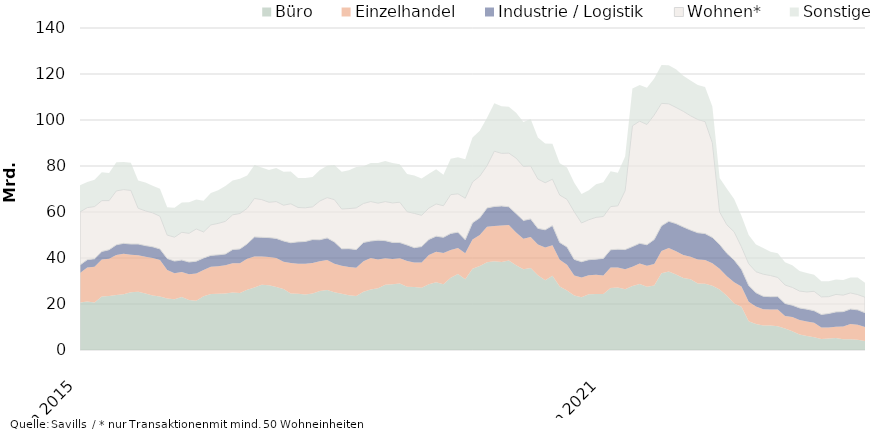
| Category | Büro | Einzelhandel | Industrie / Logistik | Wohnen* | Sonstige |
|---|---|---|---|---|---|
| 2015-06-01 | 20611425655.83 | 12812582743.14 | 3559231021.83 | 23077039312.51 | 11574720193.75 |
| 2015-07-01 | 21076839103.5 | 14823063179.21 | 3371725415.86 | 22644697118.35 | 11143910205.21 |
| 2015-08-01 | 20653227203.5 | 15571305695.21 | 3450767146.86 | 22691607883.35 | 11626767372.21 |
| 2015-09-01 | 23298875023.46 | 16009456775.73 | 3520511283.36 | 22121631489.35 | 12279196997.21 |
| 2015-10-01 | 23498374427.46 | 16189404746.36 | 3919085482.36 | 21349455176.35 | 11987539478.21 |
| 2015-11-01 | 23954025189.14 | 17369965927.5 | 4397719316.13 | 23451887702.29 | 12443601394.38 |
| 2015-12-01 | 24202213697.48 | 17618123151.04 | 4557113724.92 | 23375825542.77 | 11975940305.75 |
| 2016-01-01 | 25139700628.48 | 16272043440.89 | 4662502872.92 | 23334161447.77 | 12028959045.24 |
| 2016-02-01 | 25294714349.53 | 15953136713.43 | 4833139363.87 | 15563498654.77 | 12008953720.01 |
| 2016-03-01 | 24531552016.74 | 15986530585.16 | 4877967507.07 | 15108592339.77 | 12318880326.08 |
| 2016-04-01 | 23664635919.74 | 16375601042.51 | 4833846127.82 | 14760671477.37 | 11756957541.08 |
| 2016-05-01 | 23247789321.82 | 15930775136.51 | 4749671116.82 | 14232081715.37 | 11979556735.04 |
| 2016-06-01 | 22420837658.36 | 12351345639.5 | 4999570420.67 | 10189436595.87 | 12067576140.06 |
| 2016-07-01 | 22110698739.69 | 11244286742 | 5312245465.64 | 10404072475.53 | 12817090834.96 |
| 2016-08-01 | 23017210888.69 | 10865589625 | 5247332254.55 | 12050427222.53 | 12924367433.96 |
| 2016-09-01 | 21717860067.73 | 11265452481.91 | 5270185116.55 | 12498985369.53 | 13466325785.26 |
| 2016-10-01 | 21373387260.86 | 11859258925.28 | 5398267322.55 | 14009495152.42 | 12815064855.83 |
| 2016-11-01 | 23415620900.76 | 11358767497.14 | 5243284144.73 | 11319606979.49 | 13584628478.66 |
| 2016-12-01 | 24307948042.4 | 11930121185.43 | 4890351002.13 | 13270662270.49 | 13860642419.64 |
| 2017-01-01 | 24506316607.4 | 11942448226.96 | 4924744810.37 | 13669156871.49 | 14439441490.58 |
| 2017-02-01 | 24519637636.41 | 12367156977.09 | 4842785725 | 14202672047.49 | 15399823383.58 |
| 2017-03-01 | 24979801711.4 | 12788632177.37 | 5899654543.8 | 15102734386.79 | 14961863124.58 |
| 2017-04-01 | 24819990861.71 | 12853810575.9 | 6262060580.1 | 15423928697.19 | 15066124285.67 |
| 2017-05-01 | 26232596283.47 | 13433810629.15 | 6483702097.1 | 15457101085.2 | 14297593389.28 |
| 2017-06-01 | 27213166704.1 | 13392868477.5 | 8562546401.46 | 16743694810.79 | 14470141007.56 |
| 2017-07-01 | 28420051498.1 | 12241064346.93 | 8324132158.46 | 16422200120.79 | 13950696505.2 |
| 2017-08-01 | 28135534177.1 | 12347854135.93 | 8386695707.55 | 15384373722.79 | 13979801046.2 |
| 2017-09-01 | 27443892685.45 | 12555755916.94 | 8510058041.55 | 16031838529.78 | 14628427847.74 |
| 2017-10-01 | 26496035870.32 | 11848885272.94 | 9048046430.46 | 15582452666.87 | 14494347450.17 |
| 2017-11-01 | 24585217292.17 | 13253346842.83 | 8802947546.51 | 16950078576.87 | 13991797246.44 |
| 2017-12-01 | 24440717997.53 | 13103303236.48 | 9470343512.7 | 14943089012.87 | 12875205655.48 |
| 2018-01-01 | 24169632440.53 | 13302862745.1 | 9721702683.46 | 14639835220.86 | 12965625420.04 |
| 2018-02-01 | 24532655677.47 | 13264199130.65 | 10213193365.46 | 14254040308.86 | 12991286516.04 |
| 2018-03-01 | 25689146433.48 | 12942239136.64 | 9307934893.46 | 16861797743.49 | 13423676924.02 |
| 2018-04-01 | 26121570226.17 | 13001007210.76 | 9605919650.46 | 17541166648.49 | 13812859535.93 |
| 2018-05-01 | 25059149940.41 | 12453300846.51 | 9488564046.46 | 18391492426.48 | 14988664801.36 |
| 2018-06-01 | 24502115752.78 | 12171100363.34 | 7330050155.1 | 17325340647.56 | 16180804689.08 |
| 2018-07-01 | 23768042590.78 | 12321500226.32 | 7966869588.1 | 17451608751.56 | 16672007493.19 |
| 2018-08-01 | 23510045994.76 | 12246339005.19 | 7892000709.1 | 18149274126.41 | 17798374873.04 |
| 2018-09-01 | 25341157455.41 | 13289291079.55 | 8129841438.1 | 16963704659.42 | 16165594775.21 |
| 2018-10-01 | 26253931201.41 | 13715615099.55 | 7406435586.25 | 17175676866.32 | 16705006538.21 |
| 2018-11-01 | 26888009103.45 | 12462758251.61 | 8394898728.54 | 16109073420.32 | 17423267492.25 |
| 2018-12-01 | 28411133671.45 | 11468134571.41 | 7666795490.35 | 16990643494.32 | 17659710774.26 |
| 2019-01-01 | 28624375832.45 | 10940028832.41 | 7214323719.35 | 17176960675.2 | 17313329869.26 |
| 2019-02-01 | 28937833501.45 | 10947599659.13 | 6831262259.96 | 17531208622.2 | 16557159059.62 |
| 2019-03-01 | 27544432810.45 | 11126614873.99 | 6985219187.16 | 14491959503.27 | 16426926447.64 |
| 2019-04-01 | 27372510768.31 | 10677191485.85 | 6436402186.06 | 14907572108.14 | 16464762534.89 |
| 2019-05-01 | 27086717264.31 | 10962789793.85 | 6927571752.06 | 13595173453.14 | 15944373230.89 |
| 2019-06-01 | 28619667307.82 | 12636558136.82 | 6809920057.06 | 13635038337.47 | 14918522741.96 |
| 2019-07-01 | 29482520307.29 | 13283688977.99 | 6728675032.06 | 14018057902.47 | 15124173896.92 |
| 2019-08-01 | 28588686723.31 | 13536417530.12 | 6860393893.06 | 13753502392.62 | 13483032208.07 |
| 2019-09-01 | 31438753529.25 | 11989411711.7 | 7256389082.92 | 16861240835.62 | 15593147025.83 |
| 2019-10-01 | 33003593891.25 | 11314584887.7 | 6912990961.55 | 16703291438.74 | 15889588476.83 |
| 2019-11-01 | 30754652298.78 | 11289743755.75 | 5911146296.79 | 18052115733.74 | 16938721442.52 |
| 2019-12-01 | 35340825930.49 | 12730856743.58 | 7244059319.45 | 17720972058.74 | 19305491136.48 |
| 2020-01-01 | 36538141462.49 | 13437626311.58 | 7470737760.23 | 18158224812.87 | 19678967754.48 |
| 2020-02-01 | 38106058526.44 | 15501005020.07 | 8171253646.38 | 18363765931.37 | 20829016891.2 |
| 2020-03-01 | 38557852732.89 | 15349976510.85 | 8488042572.18 | 24050048197.37 | 20802972298.78 |
| 2020-04-01 | 38277850852.03 | 15864850742.87 | 8472070743.28 | 22908106646.5 | 20459637349.53 |
| 2020-05-01 | 38888659488.03 | 15505420856.87 | 7883168343.28 | 23336096487.5 | 20138175225.49 |
| 2020-06-01 | 36870967239.52 | 14251515683.91 | 8198149258.28 | 24099048462.5 | 19760686318.42 |
| 2020-07-01 | 35107846657.05 | 13290844419.76 | 7914460511.28 | 23512544941.5 | 19251006168.72 |
| 2020-08-01 | 35673705694.05 | 13411937855.76 | 7921045558.28 | 23019438157.5 | 20372181500.21 |
| 2020-09-01 | 32548010965.11 | 13310040555.38 | 7010552502.42 | 21488103702.49 | 18052298535.08 |
| 2020-10-01 | 30377863654.11 | 14234064134.38 | 7652755535.73 | 20471023725.49 | 17088470952.54 |
| 2020-11-01 | 32272707606.11 | 13313640008.38 | 8502380006.2 | 20188542385.49 | 15402605572.98 |
| 2020-12-01 | 27625165021.4 | 11666623548.74 | 7454893030.54 | 20611432435.49 | 13804487931.88 |
| 2021-01-01 | 25922292644.4 | 11088848627.74 | 7789843256.76 | 20716309315.49 | 13818236858.79 |
| 2021-02-01 | 23730070226.45 | 8619514795.53 | 7051796260 | 20712784697.99 | 12631393047.47 |
| 2021-03-01 | 22924554308 | 8568952326.89 | 6902626683.99 | 16854834848.99 | 12591192274.25 |
| 2021-04-01 | 24266534490 | 8199135375.01 | 6781950404.99 | 17402809013.99 | 12806454049.25 |
| 2021-05-01 | 24377578258 | 8326918360.01 | 6801070665.99 | 18167126016.99 | 14445583503.29 |
| 2021-06-01 | 24385512115 | 8003027807 | 7443919745.99 | 18226182212.99 | 14912428299.91 |
| 2021-07-01 | 26924708880 | 8972738056 | 7687165983.99 | 18785811487.74 | 15399479201.54 |
| 2021-08-01 | 27209285355 | 8614271981 | 7974574709.96 | 18901381563.74 | 14386449114.05 |
| 2021-09-01 | 26411633618 | 8699710631.91 | 8546995708.96 | 25629322018.75 | 14817521293.41 |
| 2021-10-01 | 27803946105.69 | 8411603241.91 | 8752082398.96 | 52501286139.75 | 16193947597.32 |
| 2021-11-01 | 28697609103.69 | 8929560417.91 | 8755552913.96 | 53116738980.75 | 15672351239.88 |
| 2021-12-01 | 27514290912.69 | 9152085737.86 | 9093524684.96 | 52306052488.25 | 15902058686.98 |
| 2022-01-01 | 28058935110.69 | 9374944364.07 | 10599440071.97 | 54152314759.25 | 15808671670.07 |
| 2022-02-01 | 33413067958.24 | 9651287708.13 | 10919760143.97 | 53241290616.79 | 16660777959.17 |
| 2022-03-01 | 34152785395.27 | 10180178921.43 | 11605373114.93 | 51107123050.79 | 16721923130.48 |
| 2022-04-01 | 32870499595.27 | 10059653956.43 | 12028654151.93 | 50503999418.79 | 16638583435.48 |
| 2022-05-01 | 31331193747.27 | 9993022535.43 | 12190846280.93 | 50270647458.79 | 15503593656.48 |
| 2022-06-01 | 30805994788.74 | 9769222856.42 | 11559057339.93 | 49707368541.79 | 15293074347.32 |
| 2022-07-01 | 28877258351.74 | 10509865163.8 | 11588976408.93 | 49231995043.04 | 14976215632.32 |
| 2022-08-01 | 28822980028.74 | 10300987397.8 | 11482422593.96 | 48711417034.02 | 15016259156.32 |
| 2022-09-01 | 27983288953.74 | 9741957492.89 | 11233616157.96 | 41148135072.17 | 15797891693.3 |
| 2022-10-01 | 26310579119.05 | 9011169668.89 | 10569008313.96 | 14127575596.17 | 14779961087.91 |
| 2022-11-01 | 23551831057.49 | 8552954212.89 | 9918439112.96 | 12393371042.17 | 15739891924.83 |
| 2022-12-01 | 20231163559.49 | 9220370648.94 | 9653844949.94 | 12245486492.67 | 14250701648.87 |
| 2023-01-01 | 18800895172.49 | 8804022046.73 | 7498342059.93 | 9794524565.65 | 13506223780.87 |
| 2023-02-01 | 12507936896.94 | 8493711595.67 | 7080810858.93 | 9430428360.11 | 12483668427.01 |
| 2023-03-01 | 11277202460.91 | 7614753403.37 | 6012796784.98 | 9149700734.11 | 11840579592.34 |
| 2023-04-01 | 10704483085.91 | 6968177239.37 | 5667231787.98 | 9625573016.53 | 11408854941.34 |
| 2023-05-01 | 10662217484.91 | 6917992803.37 | 5605162727.98 | 9203354222.53 | 10339897950.34 |
| 2023-06-01 | 10332027987.44 | 7302312621.37 | 5581733960.95 | 8340282543.53 | 10551986664.88 |
| 2023-07-01 | 9301131588.44 | 5438726603.99 | 5472679568.92 | 8053498413.29 | 9836570964.88 |
| 2023-08-01 | 8157547411.44 | 6203529957.29 | 5117810292.92 | 7735919836.31 | 9589231933.88 |
| 2023-09-01 | 6728450956.44 | 6313806135.29 | 5231318723.92 | 7354511172.16 | 8683241369.9 |
| 2023-10-01 | 6081386773.44 | 6264796771.29 | 5411649029.9 | 7497072986.16 | 8259637602.92 |
| 2023-11-01 | 5538120337 | 6311967179.29 | 5234388564.9 | 8430875484.01 | 7249774993 |
| 2023-12-01 | 4793393456 | 5016371925.29 | 5638783565.87 | 7663175882.01 | 6774136199 |
| 2024-01-01 | 4970977845 | 4787441645.29 | 6109375304.87 | 7327336254.03 | 6726730792 |
| 2024-02-01 | 5179162773 | 4960669781.29 | 6433838924.84 | 7598158912.03 | 6456251492 |
| 2024-03-01 | 4675106293 | 5563908045.29 | 6440176524.84 | 7203825918.03 | 6528102127 |
| 2024-04-01 | 4691427868 | 6605780221.29 | 6505272954.84 | 7016072122.61 | 6685122205 |
| 2024-05-01 | 4480114069 | 6535273548.29 | 6434309895.84 | 6655796993.61 | 7379177890 |
| 2024-06-01 | 3941040771 | 6067766454.3 | 6208709668.87 | 6740390133.61 | 6317268523 |